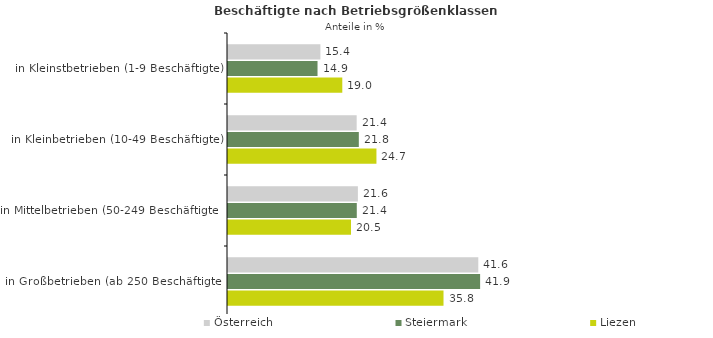
| Category | Österreich | Steiermark | Liezen |
|---|---|---|---|
| in Kleinstbetrieben (1-9 Beschäftigte) | 15.366 | 14.89 | 19.01 |
| in Kleinbetrieben (10-49 Beschäftigte) | 21.402 | 21.759 | 24.689 |
| in Mittelbetrieben (50-249 Beschäftigte) | 21.603 | 21.42 | 20.457 |
| in Großbetrieben (ab 250 Beschäftigte) | 41.629 | 41.932 | 35.843 |